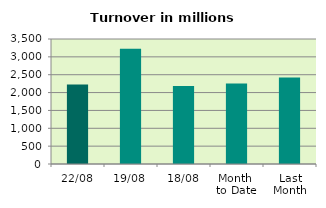
| Category | Series 0 |
|---|---|
| 22/08 | 2228.614 |
| 19/08 | 3225.589 |
| 18/08 | 2185.366 |
| Month 
to Date | 2257.006 |
| Last
Month | 2421.628 |